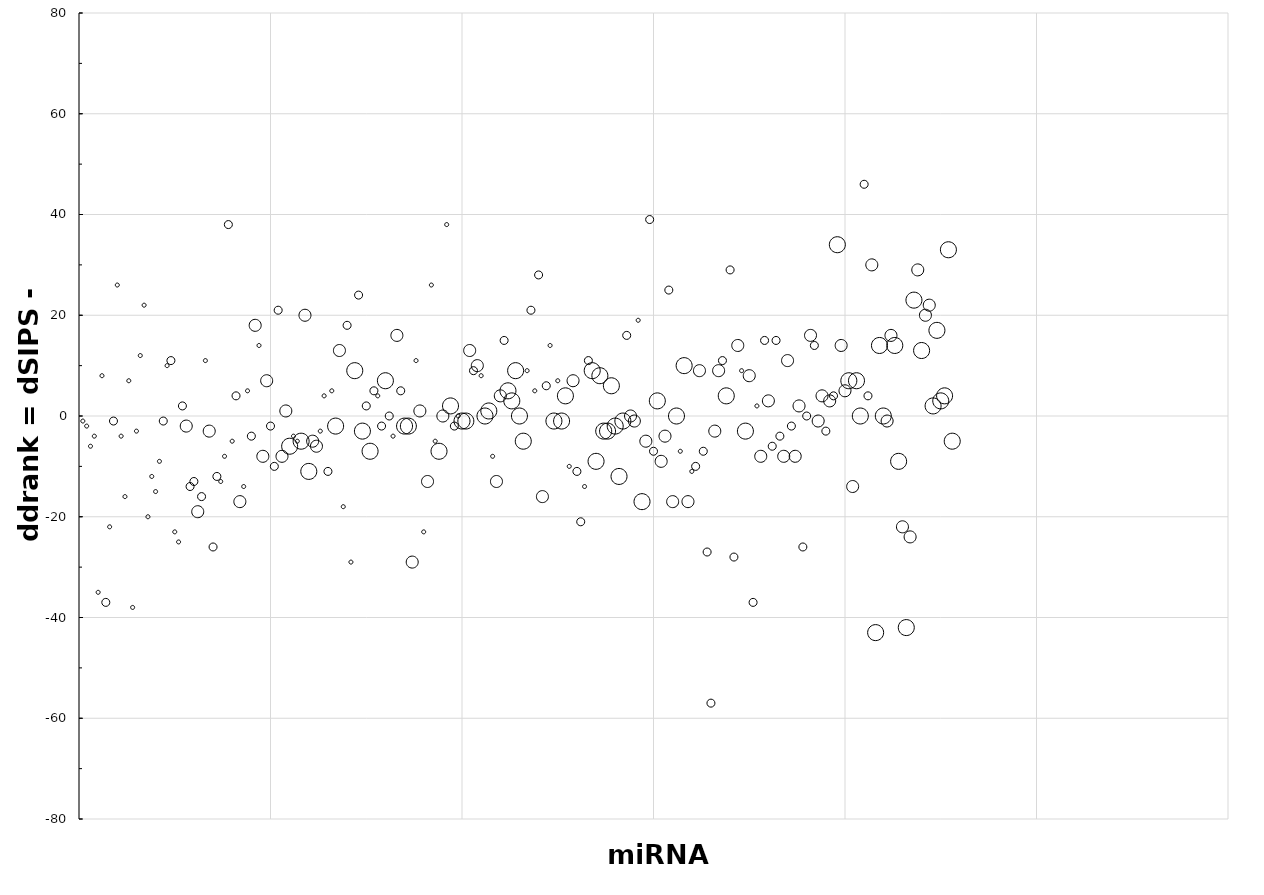
| Category | ΔΔrank = ΔSIPS-ΔQ |
|---|---|
| 0 | -1 |
| 1 | -2 |
| 2 | -6 |
| 3 | -4 |
| 4 | -35 |
| 5 | 8 |
| 6 | -37 |
| 7 | -22 |
| 8 | -1 |
| 9 | 26 |
| 10 | -4 |
| 11 | -16 |
| 12 | 7 |
| 13 | -38 |
| 14 | -3 |
| 15 | 12 |
| 16 | 22 |
| 17 | -20 |
| 18 | -12 |
| 19 | -15 |
| 20 | -9 |
| 21 | -1 |
| 22 | 10 |
| 23 | 11 |
| 24 | -23 |
| 25 | -25 |
| 26 | 2 |
| 27 | -2 |
| 28 | -14 |
| 29 | -13 |
| 30 | -19 |
| 31 | -16 |
| 32 | 11 |
| 33 | -3 |
| 34 | -26 |
| 35 | -12 |
| 36 | -13 |
| 37 | -8 |
| 38 | 38 |
| 39 | -5 |
| 40 | 4 |
| 41 | -17 |
| 42 | -14 |
| 43 | 5 |
| 44 | -4 |
| 45 | 18 |
| 46 | 14 |
| 47 | -8 |
| 48 | 7 |
| 49 | -2 |
| 50 | -10 |
| 51 | 21 |
| 52 | -8 |
| 53 | 1 |
| 54 | -6 |
| 55 | -4 |
| 56 | -5 |
| 57 | -5 |
| 58 | 20 |
| 59 | -11 |
| 60 | -5 |
| 61 | -6 |
| 62 | -3 |
| 63 | 4 |
| 64 | -11 |
| 65 | 5 |
| 66 | -2 |
| 67 | 13 |
| 68 | -18 |
| 69 | 18 |
| 70 | -29 |
| 71 | 9 |
| 72 | 24 |
| 73 | -3 |
| 74 | 2 |
| 75 | -7 |
| 76 | 5 |
| 77 | 4 |
| 78 | -2 |
| 79 | 7 |
| 80 | 0 |
| 81 | -4 |
| 82 | 16 |
| 83 | 5 |
| 84 | -2 |
| 85 | -2 |
| 86 | -29 |
| 87 | 11 |
| 88 | 1 |
| 89 | -23 |
| 90 | -13 |
| 91 | 26 |
| 92 | -5 |
| 93 | -7 |
| 94 | 0 |
| 95 | 38 |
| 96 | 2 |
| 97 | -2 |
| 98 | 0 |
| 99 | -1 |
| 100 | -1 |
| 101 | 13 |
| 102 | 9 |
| 103 | 10 |
| 104 | 8 |
| 105 | 0 |
| 106 | 1 |
| 107 | -8 |
| 108 | -13 |
| 109 | 4 |
| 110 | 15 |
| 111 | 5 |
| 112 | 3 |
| 113 | 9 |
| 114 | 0 |
| 115 | -5 |
| 116 | 9 |
| 117 | 21 |
| 118 | 5 |
| 119 | 28 |
| 120 | -16 |
| 121 | 6 |
| 122 | 14 |
| 123 | -1 |
| 124 | 7 |
| 125 | -1 |
| 126 | 4 |
| 127 | -10 |
| 128 | 7 |
| 129 | -11 |
| 130 | -21 |
| 131 | -14 |
| 132 | 11 |
| 133 | 9 |
| 134 | -9 |
| 135 | 8 |
| 136 | -3 |
| 137 | -3 |
| 138 | 6 |
| 139 | -2 |
| 140 | -12 |
| 141 | -1 |
| 142 | 16 |
| 143 | 0 |
| 144 | -1 |
| 145 | 19 |
| 146 | -17 |
| 147 | -5 |
| 148 | 39 |
| 149 | -7 |
| 150 | 3 |
| 151 | -9 |
| 152 | -4 |
| 153 | 25 |
| 154 | -17 |
| 155 | 0 |
| 156 | -7 |
| 157 | 10 |
| 158 | -17 |
| 159 | -11 |
| 160 | -10 |
| 161 | 9 |
| 162 | -7 |
| 163 | -27 |
| 164 | -57 |
| 165 | -3 |
| 166 | 9 |
| 167 | 11 |
| 168 | 4 |
| 169 | 29 |
| 170 | -28 |
| 171 | 14 |
| 172 | 9 |
| 173 | -3 |
| 174 | 8 |
| 175 | -37 |
| 176 | 2 |
| 177 | -8 |
| 178 | 15 |
| 179 | 3 |
| 180 | -6 |
| 181 | 15 |
| 182 | -4 |
| 183 | -8 |
| 184 | 11 |
| 185 | -2 |
| 186 | -8 |
| 187 | 2 |
| 188 | -26 |
| 189 | 0 |
| 190 | 16 |
| 191 | 14 |
| 192 | -1 |
| 193 | 4 |
| 194 | -3 |
| 195 | 3 |
| 196 | 4 |
| 197 | 34 |
| 198 | 14 |
| 199 | 5 |
| 200 | 7 |
| 201 | -14 |
| 202 | 7 |
| 203 | 0 |
| 204 | 46 |
| 205 | 4 |
| 206 | 30 |
| 207 | -43 |
| 208 | 14 |
| 209 | 0 |
| 210 | -1 |
| 211 | 16 |
| 212 | 14 |
| 213 | -9 |
| 214 | -22 |
| 215 | -42 |
| 216 | -24 |
| 217 | 23 |
| 218 | 29 |
| 219 | 13 |
| 220 | 20 |
| 221 | 22 |
| 222 | 2 |
| 223 | 17 |
| 224 | 3 |
| 225 | 4 |
| 226 | 33 |
| 227 | -5 |